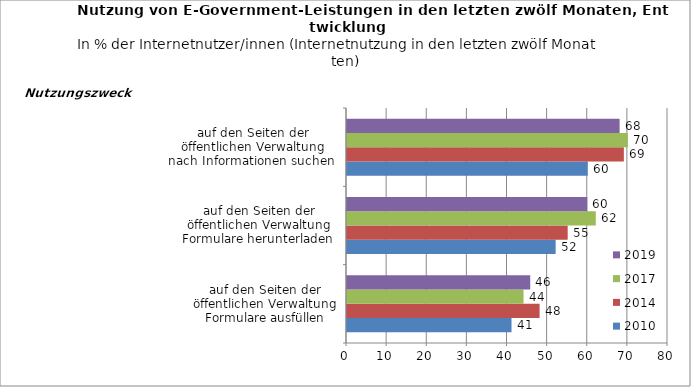
| Category | 2010 | 2014 | 2017 | 2019 |
|---|---|---|---|---|
| auf den Seiten der öffentlichen Verwaltung Formulare ausfüllen | 41 | 48 | 44 | 45.664 |
| auf den Seiten der öffentlichen Verwaltung Formulare herunterladen  | 52 | 55 | 62 | 59.885 |
| auf den Seiten der öffentlichen Verwaltung nach Informationen suchen  | 60 | 69 | 70 | 67.94 |